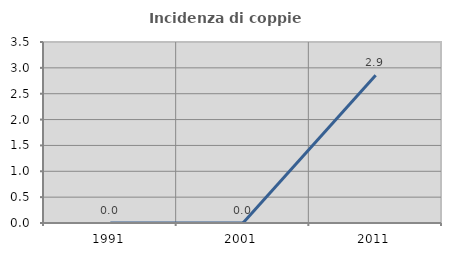
| Category | Incidenza di coppie miste |
|---|---|
| 1991.0 | 0 |
| 2001.0 | 0 |
| 2011.0 | 2.857 |